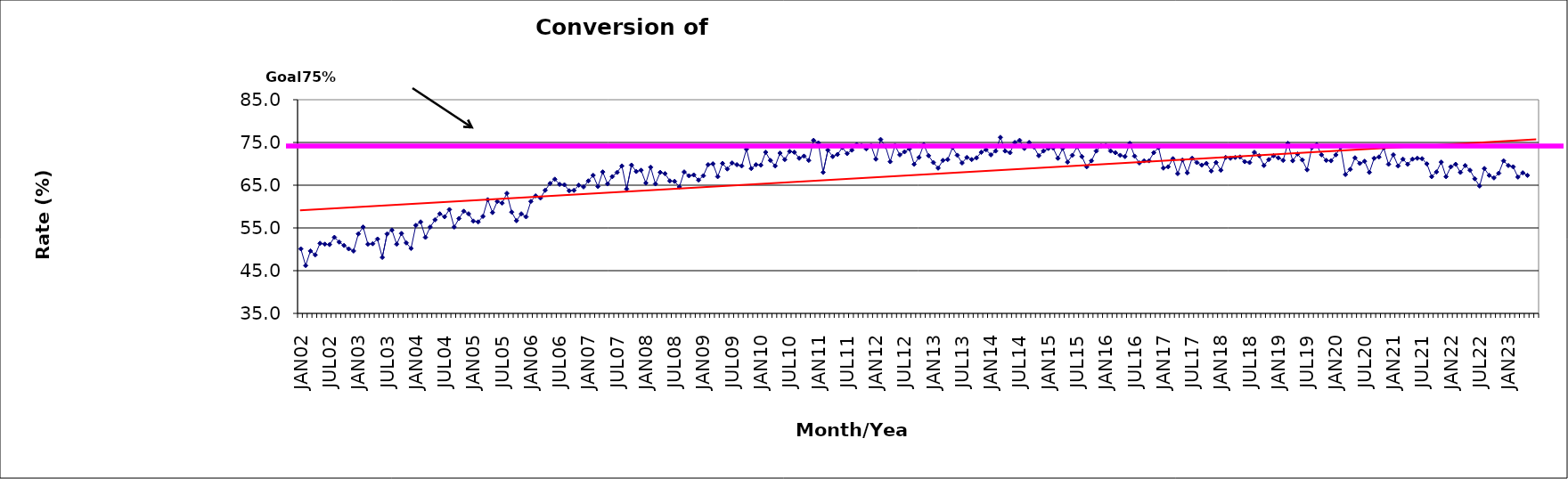
| Category | Series 0 |
|---|---|
| JAN02 | 50.1 |
| FEB02 | 46.2 |
| MAR02 | 49.6 |
| APR02 | 48.7 |
| MAY02 | 51.4 |
| JUN02 | 51.2 |
| JUL02 | 51.1 |
| AUG02 | 52.8 |
| SEP02 | 51.7 |
| OCT02 | 50.9 |
| NOV02 | 50.1 |
| DEC02 | 49.6 |
| JAN03 | 53.6 |
| FEB03 | 55.2 |
| MAR03 | 51.2 |
| APR03 | 51.3 |
| MAY03 | 52.4 |
| JUN03 | 48.1 |
| JUL03 | 53.6 |
| AUG03 | 54.5 |
| SEP03 | 51.2 |
| OCT03 | 53.7 |
| NOV03 | 51.5 |
| DEC03 | 50.2 |
| JAN04 | 55.6 |
| FEB04 | 56.4 |
| MAR04 | 52.8 |
| APR04 | 55.2 |
| MAY04 | 56.9 |
| JUN04 | 58.3 |
| JUL04 | 57.6 |
| AUG04 | 59.3 |
| SEP04 | 55.2 |
| OCT04 | 57.2 |
| NOV04 | 58.9 |
| DEC04 | 58.3 |
| JAN05 | 56.6 |
| FEB05 | 56.4 |
| MAR05 | 57.7 |
| APR05 | 61.6 |
| MAY05 | 58.6 |
| JUN05 | 61.2 |
| JUL05 | 60.8 |
| AUG05 | 63.1 |
| SEP05 | 58.7 |
| OCT05 | 56.7 |
| NOV05 | 58.3 |
| DEC05 | 57.6 |
| JAN06 | 61.2 |
| FEB06 | 62.5 |
| MAR06 | 62 |
| APR06 | 63.8 |
| MAY06 | 65.4 |
| JUN06 | 66.4 |
| JUL06 | 65.2 |
| AUG06 | 65.1 |
| SEP06 | 63.7 |
| OCT06 | 63.8 |
| NOV06 | 65 |
| DEC06 | 64.6 |
| JAN07 | 66 |
| FEB07 | 67.3 |
| MAR07 | 64.7 |
| APR07 | 68.1 |
| MAY07 | 65.3 |
| JUN07 | 67 |
| JUL07 | 68 |
| AUG07 | 69.5 |
| SEP07 | 64.1 |
| OCT07 | 69.7 |
| NOV07 | 68.2 |
| DEC07 | 68.5 |
| JAN08 | 65.5 |
| FEB08 | 69.2 |
| MAR08 | 65.3 |
| APR08 | 68 |
| MAY08 | 67.7 |
| JUN08 | 66 |
| JUL08 | 65.9 |
| AUG08 | 64.6 |
| SEP08 | 68.1 |
| OCT08 | 67.2 |
| NOV08 | 67.4 |
| DEC08 | 66.2 |
| JAN09 | 67.2 |
| FEB09 | 69.8 |
| MAR09 | 70 |
| APR09 | 67 |
| MAY09 | 70.1 |
| JUN09 | 68.8 |
| JUL09 | 70.2 |
| AUG09 | 69.8 |
| SEP09 | 69.5 |
| OCT09 | 73.4 |
| NOV09 | 68.9 |
| DEC09 | 69.8 |
| JAN10 | 69.7 |
| FEB10 | 72.7 |
| MAR10 | 70.8 |
| APR10 | 69.5 |
| MAY10 | 72.5 |
| JUN10 | 71 |
| JUL10 | 72.9 |
| AUG10 | 72.7 |
| SEP10 | 71.3 |
| OCT10 | 71.8 |
| NOV10 | 70.8 |
| DEC10 | 75.5 |
| JAN11 | 74.9 |
| FEB11 | 68 |
| MAR11 | 73.2 |
| APR11 | 71.7 |
| MAY11 | 72.2 |
| JUN11 | 73.8 |
| JUL11 | 72.4 |
| AUG11 | 73.2 |
| SEP11 | 74.5 |
| OCT11 | 74.3 |
| NOV11 | 73.5 |
| DEC11 | 74.3 |
| JAN12 | 71.1 |
| FEB12 | 75.7 |
| MAR12 | 74.1 |
| APR12 | 70.5 |
| MAY12 | 74.3 |
| JUN12 | 72.1 |
| JUL12 | 72.8 |
| AUG12 | 73.5 |
| SEP12 | 69.9 |
| OCT12 | 71.5 |
| NOV12 | 74.5 |
| DEC12 | 71.9 |
| JAN13 | 70.3 |
| FEB13 | 69 |
| MAR13 | 70.8 |
| APR13 | 71 |
| MAY13 | 73.8 |
| JUN13 | 72 |
| JUL13 | 70.2 |
| AUG13 | 71.5 |
| SEP13 | 71 |
| OCT13 | 71.4 |
| NOV13 | 72.7 |
| DEC13 | 73.3 |
| JAN14 | 72.1 |
| FEB14 | 73 |
| MAR14 | 76.2 |
| APR14 | 73 |
| MAY14 | 72.6 |
| JUN14 | 75 |
| JUL14 | 75.5 |
| AUG14 | 73.6 |
| SEP14 | 75 |
| OCT14 | 73.9 |
| NOV14 | 71.9 |
| DEC14 | 73 |
| JAN15 | 73.6 |
| FEB15 | 73.7 |
| MAR15 | 71.3 |
| APR15 | 73.6 |
| MAY15 | 70.4 |
| JUN15 | 72 |
| JUL15 | 74 |
| AUG15 | 71.7 |
| SEP15 | 69.3 |
| OCT15 | 70.7 |
| NOV15 | 73 |
| DEC15 | 74.2 |
| JAN16 | 74.3 |
| FEB16 | 73 |
| MAR16 | 72.6 |
| APR16 | 72 |
| MAY16 | 71.7 |
| JUN16 | 74.8 |
| JUL16 | 71.8 |
| AUG16 | 70.2 |
| SEP16 | 70.7 |
| OCT16 | 70.7 |
| NOV16 | 72.6 |
| DEC16 | 73.8 |
| JAN17 | 69 |
| FEB17 | 69.3 |
| MAR17 | 71.2 |
| APR17 | 67.7 |
| MAY17 | 70.9 |
| JUN17 | 67.9 |
| JUL17 | 71.3 |
| AUG17 | 70.3 |
| SEP17 | 69.7 |
| OCT17 | 70.1 |
| NOV17 | 68.3 |
| DEC17 | 70.3 |
| JAN18 | 68.5 |
| FEB18 | 71.5 |
| MAR18 | 71.3 |
| APR18 | 71.5 |
| MAY18 | 71.6 |
| JUN18 | 70.5 |
| JUL18 | 70.3 |
| AUG18 | 72.7 |
| SEP18 | 71.9 |
| OCT18 | 69.6 |
| NOV18 | 71 |
| DEC18 | 71.9 |
| JAN19 | 71.4 |
| FEB19 | 70.8 |
| MAR19 | 74.8 |
| APR19 | 70.7 |
| MAY19 | 72.3 |
| JUN19 | 70.9 |
| JUL19 | 68.6 |
| AUG19 | 73.8 |
| SEP19 | 74.5 |
| OCT19 | 72.1 |
| NOV19 | 70.8 |
| DEC19 | 70.7 |
| JAN20 | 72.1 |
| FEB20 | 73.9 |
| MAR20 | 67.5 |
| APR20 | 68.7 |
| MAY20 | 71.4 |
| JUN20 | 70.1 |
| JUL20 | 70.6 |
| AUG20 | 68 |
| SEP20 | 71.3 |
| OCT20 | 71.6 |
| NOV20 | 73.7 |
| DEC20 | 69.9 |
| JAN21 | 72.1 |
| FEB21 | 69.5 |
| MAR21 | 71.1 |
| APR21 | 69.9 |
| MAY21 | 71.1 |
| JUN21 | 71.3 |
| JUL21 | 71.2 |
| AUG21 | 70 |
| SEP21 | 67 |
| OCT21 | 68.1 |
| NOV21 | 70.4 |
| DEC21 | 67 |
| JAN22 | 69.3 |
| FEB22 | 69.9 |
| MAR22 | 68 |
| APR22 | 69.6 |
| MAY22 | 68.5 |
| JUN22 | 66.5 |
| JUL22 | 64.8 |
| AUG22 | 68.9 |
| SEP22 | 67.3 |
| OCT22 | 66.7 |
| NOV22 | 67.8 |
| DEC22 | 70.7 |
| JAN23 | 69.6 |
| FEB23 | 69.3 |
| MAR23 | 66.9 |
| APR23 | 67.9 |
| MAY23 | 67.3 |